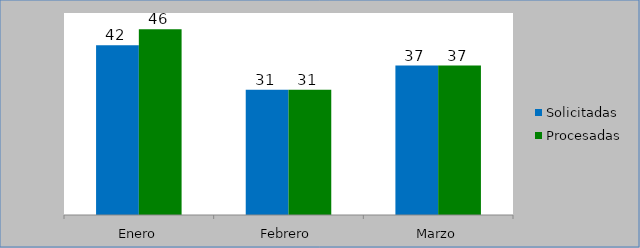
| Category | Solicitadas | Procesadas |
|---|---|---|
| Enero | 42 | 46 |
| Febrero | 31 | 31 |
| Marzo | 37 | 37 |